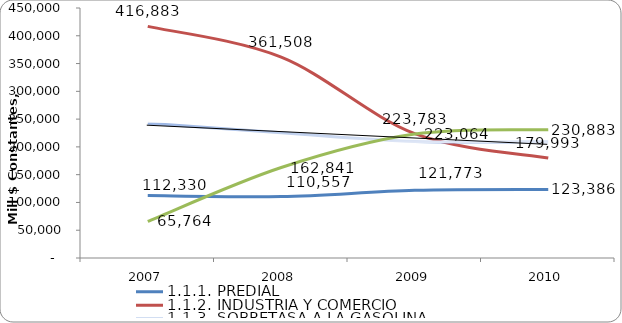
| Category | 1.1.1. PREDIAL | 1.1.2. INDUSTRIA Y COMERCIO | 1.1.3. SOBRETASA A LA GASOLINA | 1.1.4. OTROS |
|---|---|---|---|---|
| 2007 | 112330.38 | 416883.49 | 242593.512 | 65764.373 |
| 2008 | 110557.158 | 361508.299 | 225470.978 | 162841.32 |
| 2009 | 121772.583 | 223782.952 | 209774.529 | 223063.857 |
| 2010 | 123386 | 179993 | 209460 | 230883 |